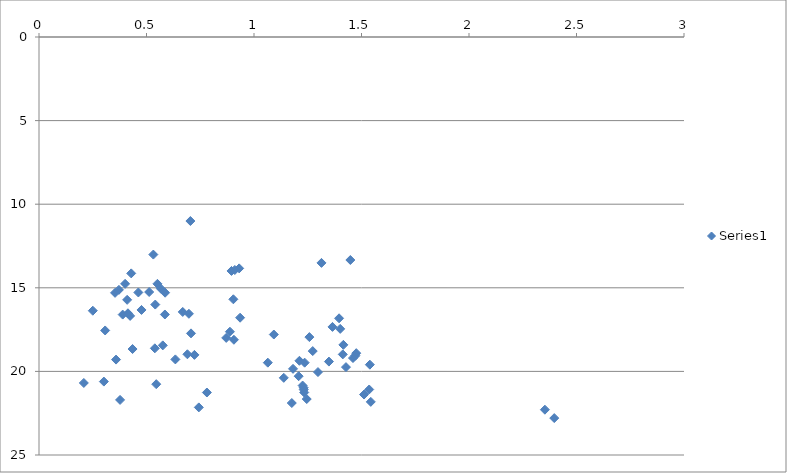
| Category | Series 0 |
|---|---|
| 0.697246 | 16.554 |
| 0.400557 | 14.763 |
| 0.704166 | 11.006 |
| 1.415676 | 18.412 |
| 1.475583 | 18.91 |
| 1.064297 | 19.478 |
| 1.181603 | 19.847 |
| 1.226231 | 20.847 |
| 1.535875 | 21.082 |
| 2.352984 | 22.291 |
| 1.543238 | 21.823 |
| 0.462098 | 15.279 |
| 1.231077 | 20.978 |
| 1.138529 | 20.385 |
| 1.207697 | 20.287 |
| 0.586551 | 15.293 |
| 0.566803 | 15.05 |
| 1.175734 | 21.891 |
| 0.389248 | 16.602 |
| 0.93102 | 13.839 |
| 1.400898 | 17.457 |
| 2.396572 | 22.792 |
| 1.448135 | 13.337 |
| 0.585533 | 16.596 |
| 0.895353 | 13.993 |
| 0.423846 | 16.68 |
| 0.51247 | 15.251 |
| 0.668545 | 16.444 |
| 0.353757 | 15.302 |
| 0.476797 | 16.325 |
| 0.410053 | 15.72 |
| 1.395689 | 16.824 |
| 0.935392 | 16.789 |
| 0.435171 | 18.662 |
| 0.690298 | 18.975 |
| 0.870767 | 17.996 |
| 1.273115 | 18.784 |
| 1.348488 | 19.413 |
| 1.538864 | 19.597 |
| 0.301692 | 20.609 |
| 0.37711 | 21.705 |
| 0.910699 | 13.935 |
| 0.531814 | 13.013 |
| 0.250261 | 16.371 |
| 0.540835 | 16.002 |
| 0.550782 | 14.763 |
| 0.538763 | 18.619 |
| 1.092192 | 17.795 |
| 1.25761 | 17.949 |
| 1.297514 | 20.04 |
| 1.233585 | 21.261 |
| 1.235657 | 19.478 |
| 0.371651 | 15.123 |
| 1.427811 | 19.743 |
| 0.428917 | 14.138 |
| 0.307739 | 17.552 |
| 0.903983 | 15.687 |
| 0.707032 | 17.725 |
| 0.634285 | 19.283 |
| 0.358288 | 19.293 |
| 0.575756 | 18.444 |
| 1.511757 | 21.384 |
| 1.365093 | 17.34 |
| 1.46036 | 19.201 |
| 1.313846 | 13.511 |
| 0.888014 | 17.627 |
| 0.90661 | 18.107 |
| 1.413042 | 18.983 |
| 0.413757 | 16.525 |
| 0.722826 | 19.012 |
| 1.211386 | 19.365 |
| 1.47148 | 19.06 |
| 0.208477 | 20.691 |
| 0.74342 | 22.153 |
| 0.780916 | 21.263 |
| 0.545318 | 20.764 |
| 1.231459 | 21.091 |
| 1.245253 | 21.653 |